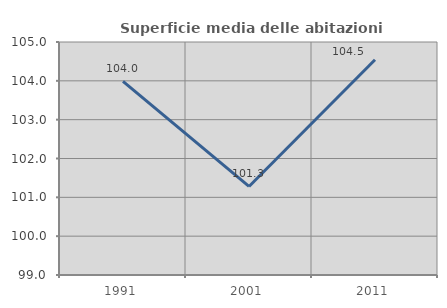
| Category | Superficie media delle abitazioni occupate |
|---|---|
| 1991.0 | 103.986 |
| 2001.0 | 101.28 |
| 2011.0 | 104.542 |